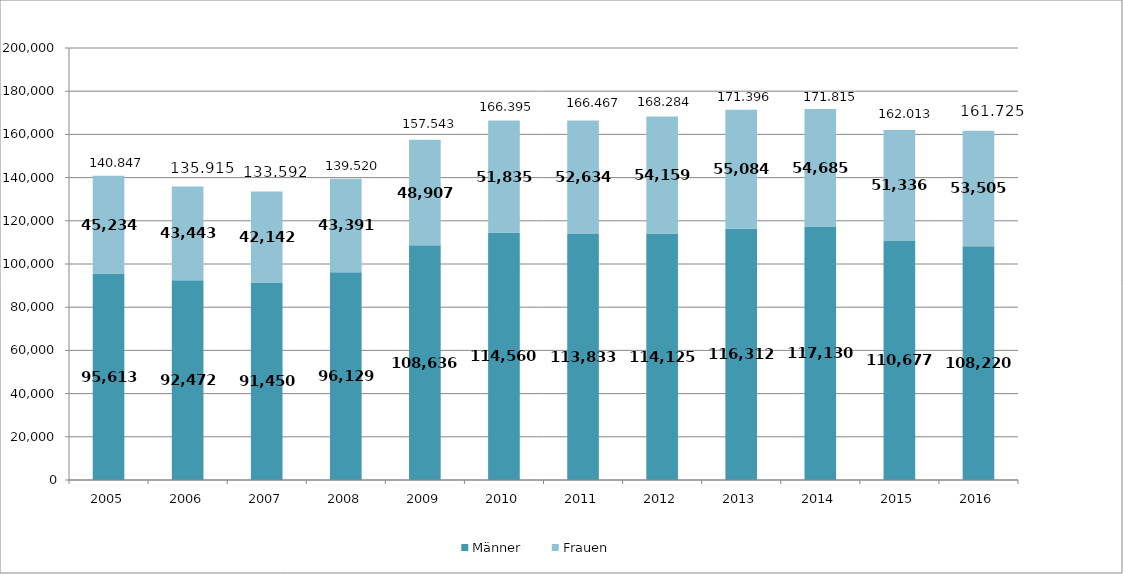
| Category | Männer | Frauen |
|---|---|---|
| 2005.0 | 95613 | 45234 |
| 2006.0 | 92472 | 43443 |
| 2007.0 | 91450 | 42142 |
| 2008.0 | 96129 | 43391 |
| 2009.0 | 108636 | 48907 |
| 2010.0 | 114560 | 51835 |
| 2011.0 | 113833 | 52634 |
| 2012.0 | 114125 | 54159 |
| 2013.0 | 116312 | 55084 |
| 2014.0 | 117130 | 54685 |
| 2015.0 | 110677 | 51336 |
| 2016.0 | 108220 | 53505 |